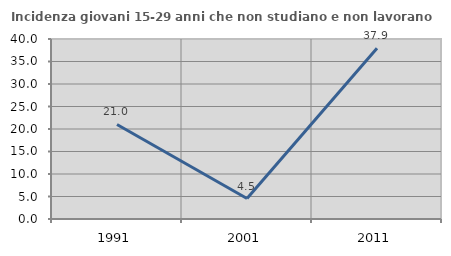
| Category | Incidenza giovani 15-29 anni che non studiano e non lavorano  |
|---|---|
| 1991.0 | 21.014 |
| 2001.0 | 4.545 |
| 2011.0 | 37.931 |